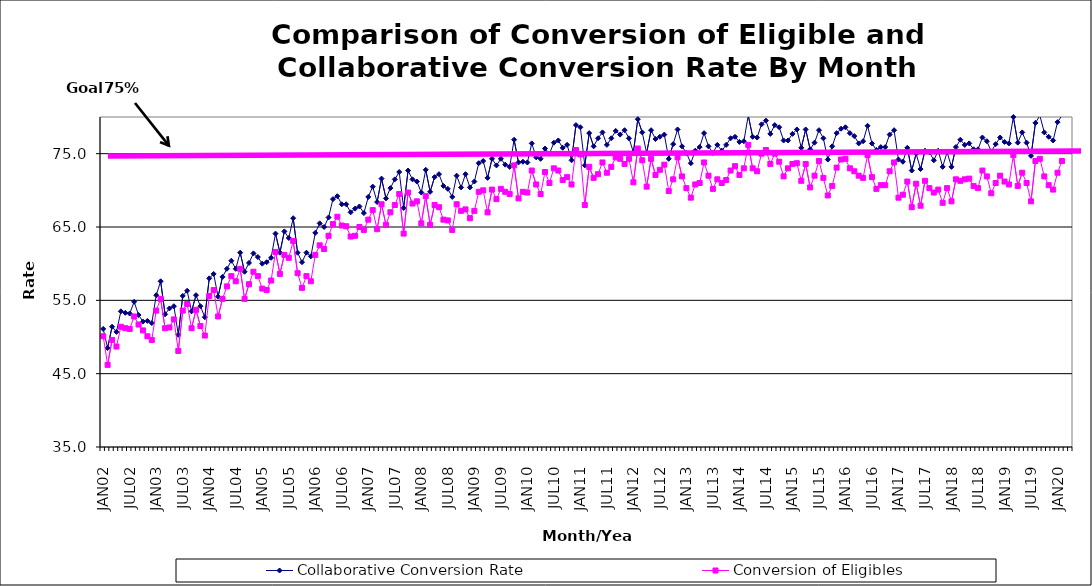
| Category | Collaborative Conversion Rate | Conversion of Eligibles |
|---|---|---|
| JAN02 | 51.1 | 50.1 |
| FEB02 | 48.5 | 46.2 |
| MAR02 | 51.4 | 49.6 |
| APR02 | 50.7 | 48.7 |
| MAY02 | 53.5 | 51.4 |
| JUN02 | 53.3 | 51.2 |
| JUL02 | 53.2 | 51.1 |
| AUG02 | 54.8 | 52.8 |
| SEP02 | 53 | 51.7 |
| OCT02 | 52.1 | 50.9 |
| NOV02 | 52.2 | 50.1 |
| DEC02 | 51.9 | 49.6 |
| JAN03 | 55.7 | 53.6 |
| FEB03 | 57.6 | 55.2 |
| MAR03 | 53.1 | 51.2 |
| APR03 | 53.9 | 51.3 |
| MAY03 | 54.2 | 52.4 |
| JUN03 | 50.3 | 48.1 |
| JUL03 | 55.6 | 53.6 |
| AUG03 | 56.3 | 54.5 |
| SEP03 | 53.5 | 51.2 |
| OCT03 | 55.7 | 53.7 |
| NOV03 | 54.2 | 51.5 |
| DEC03 | 52.7 | 50.2 |
| JAN04 | 58 | 55.6 |
| FEB04 | 58.6 | 56.4 |
| MAR04 | 55.5 | 52.8 |
| APR04 | 58.2 | 55.2 |
| MAY04 | 59.3 | 56.9 |
| JUN04 | 60.4 | 58.3 |
| JUL04 | 59.3 | 57.6 |
| AUG04 | 61.5 | 59.3 |
| SEP04 | 58.9 | 55.2 |
| OCT04 | 60.1 | 57.2 |
| NOV04 | 61.4 | 58.9 |
| DEC04 | 60.9 | 58.3 |
| JAN05 | 60 | 56.6 |
| FEB05 | 60.2 | 56.4 |
| MAR05 | 60.8 | 57.7 |
| APR05 | 64.1 | 61.6 |
| MAY05 | 61.5 | 58.6 |
| JUN05 | 64.4 | 61.2 |
| JUL05 | 63.5 | 60.8 |
| AUG05 | 66.2 | 63.1 |
| SEP05 | 61.5 | 58.7 |
| OCT05 | 60.2 | 56.7 |
| NOV05 | 61.5 | 58.3 |
| DEC05 | 61 | 57.6 |
| JAN06 | 64.2 | 61.2 |
| FEB06 | 65.5 | 62.5 |
| MAR06 | 65 | 62 |
| APR06 | 66.3 | 63.8 |
| MAY06 | 68.8 | 65.4 |
| JUN06 | 69.2 | 66.4 |
| JUL06 | 68.1 | 65.2 |
| AUG06 | 68.1 | 65.1 |
| SEP06 | 67 | 63.7 |
| OCT06 | 67.5 | 63.8 |
| NOV06 | 67.8 | 65 |
| DEC06 | 66.9 | 64.6 |
| JAN07 | 69.1 | 66 |
| FEB07 | 70.5 | 67.3 |
| MAR07 | 68.4 | 64.7 |
| APR07 | 71.6 | 68.1 |
| MAY07 | 68.9 | 65.3 |
| JUN07 | 70.3 | 67 |
| JUL07 | 71.5 | 68 |
| AUG07 | 72.5 | 69.5 |
| SEP07 | 67.6 | 64.1 |
| OCT07 | 72.7 | 69.7 |
| NOV07 | 71.5 | 68.2 |
| DEC07 | 71.2 | 68.5 |
| JAN08 | 69.7 | 65.5 |
| FEB08 | 72.8 | 69.2 |
| MAR08 | 69.8 | 65.3 |
| APR08 | 71.8 | 68 |
| MAY08 | 72.2 | 67.7 |
| JUN08 | 70.6 | 66 |
| JUL08 | 70.2 | 65.9 |
| AUG08 | 69.1 | 64.6 |
| SEP08 | 72 | 68.1 |
| OCT08 | 70.4 | 67.2 |
| NOV08 | 72.2 | 67.4 |
| DEC08 | 70.4 | 66.2 |
| JAN09 | 71.2 | 67.2 |
| FEB09 | 73.7 | 69.8 |
| MAR09 | 74 | 70 |
| APR09 | 71.7 | 67 |
| MAY09 | 74.3 | 70.1 |
| JUN09 | 73.4 | 68.8 |
| JUL09 | 74.3 | 70.2 |
| AUG09 | 73.5 | 69.8 |
| SEP09 | 73.2 | 69.5 |
| OCT09 | 76.9 | 73.4 |
| NOV09 | 73.8 | 68.9 |
| DEC09 | 73.9 | 69.8 |
| JAN10 | 73.8 | 69.7 |
| FEB10 | 76.4 | 72.7 |
| MAR10 | 74.5 | 70.8 |
| APR10 | 74.3 | 69.5 |
| MAY10 | 75.7 | 72.5 |
| JUN10 | 75 | 71 |
| JUL10 | 76.5 | 73 |
| AUG10 | 76.8 | 72.7 |
| SEP10 | 75.8 | 71.4 |
| OCT10 | 76.2 | 71.8 |
| NOV10 | 74.1 | 70.8 |
| DEC10 | 78.9 | 75.5 |
| JAN11 | 78.6 | 74.9 |
| FEB11 | 73.4 | 68 |
| MAR11 | 77.8 | 73.2 |
| APR11 | 76 | 71.7 |
| MAY11 | 77.1 | 72.2 |
| JUN11 | 77.9 | 73.8 |
| JUL11 | 76.2 | 72.4 |
| AUG11 | 77.1 | 73.2 |
| SEP11 | 78.1 | 74.5 |
| OCT11 | 77.6 | 74.3 |
| NOV11 | 78.2 | 73.6 |
| DEC11 | 77.1 | 74.3 |
| JAN12 | 75.2 | 71.1 |
| FEB12 | 79.7 | 75.7 |
| MAR12 | 77.9 | 74.1 |
| APR12 | 75.1 | 70.5 |
| MAY12 | 78.2 | 74.3 |
| JUN12 | 77 | 72.1 |
| JUL12 | 77.3 | 72.8 |
| AUG12 | 77.6 | 73.5 |
| SEP12 | 74.3 | 69.9 |
| OCT12 | 76.3 | 71.5 |
| NOV12 | 78.3 | 74.5 |
| DEC12 | 76 | 71.9 |
| JAN13 | 75.1 | 70.3 |
| FEB13 | 73.7 | 69 |
| MAR13 | 75.4 | 70.8 |
| APR13 | 75.9 | 71 |
| MAY13 | 77.8 | 73.8 |
| JUN13 | 76 | 72 |
| JUL13 | 75.1 | 70.2 |
| AUG13 | 76.2 | 71.5 |
| SEP13 | 75.4 | 71 |
| OCT13 | 76.2 | 71.4 |
| NOV13 | 77.1 | 72.7 |
| DEC13 | 77.3 | 73.3 |
| JAN14 | 76.6 | 72.1 |
| FEB14 | 76.7 | 73 |
| MAR14 | 80.2 | 76.2 |
| APR14 | 77.3 | 73 |
| MAY14 | 77.2 | 72.6 |
| JUN14 | 79 | 75 |
| JUL14 | 79.5 | 75.5 |
| AUG14 | 77.7 | 73.6 |
| SEP14 | 78.9 | 75 |
| OCT14 | 78.6 | 73.9 |
| NOV14 | 76.8 | 71.9 |
| DEC14 | 76.8 | 73 |
| JAN15 | 77.7 | 73.6 |
| FEB15 | 78.3 | 73.7 |
| MAR15 | 75.8 | 71.3 |
| APR15 | 78.3 | 73.6 |
| MAY15 | 75.6 | 70.4 |
| JUN15 | 76.5 | 72 |
| JUL15 | 78.2 | 74 |
| AUG15 | 77.1 | 71.7 |
| SEP15 | 74.2 | 69.3 |
| OCT15 | 76 | 70.6 |
| NOV15 | 77.8 | 73.1 |
| DEC15 | 78.4 | 74.2 |
| JAN16 | 78.6 | 74.3 |
| FEB16 | 77.8 | 73 |
| MAR16 | 77.4 | 72.6 |
| APR16 | 76.4 | 72 |
| MAY16 | 76.7 | 71.7 |
| JUN16 | 78.8 | 74.8 |
| JUL16 | 76.4 | 71.8 |
| AUG16 | 75.5 | 70.2 |
| SEP16 | 75.9 | 70.7 |
| OCT16 | 75.9 | 70.7 |
| NOV16 | 77.6 | 72.6 |
| DEC16 | 78.2 | 73.8 |
| JAN17 | 74.2 | 69 |
| FEB17 | 73.9 | 69.4 |
| MAR17 | 75.8 | 71.2 |
| APR17 | 72.7 | 67.7 |
| MAY17 | 75 | 70.9 |
| JUN17 | 72.9 | 67.9 |
| JUL17 | 75.4 | 71.3 |
| AUG17 | 75.2 | 70.3 |
| SEP17 | 74.1 | 69.7 |
| OCT17 | 75.4 | 70.1 |
| NOV17 | 73.2 | 68.3 |
| DEC17 | 75.2 | 70.3 |
| JAN18 | 73.2 | 68.5 |
| FEB18 | 75.9 | 71.5 |
| MAR18 | 76.9 | 71.3 |
| APR18 | 76.2 | 71.5 |
| MAY18 | 76.4 | 71.6 |
| JUN18 | 75.6 | 70.6 |
| JUL18 | 75.6 | 70.3 |
| AUG18 | 77.2 | 72.7 |
| SEP18 | 76.7 | 71.9 |
| OCT18 | 75.3 | 69.6 |
| NOV18 | 76.3 | 71 |
| DEC18 | 77.2 | 72 |
| JAN19 | 76.6 | 71.2 |
| FEB19 | 76.4 | 70.8 |
| MAR19 | 80 | 74.8 |
| APR19 | 76.5 | 70.6 |
| MAY19 | 77.9 | 72.4 |
| JUN19 | 76.5 | 71 |
| JUL19 | 74.7 | 68.5 |
| AUG19 | 79.2 | 74 |
| SEP19 | 80.2 | 74.3 |
| OCT19 | 77.9 | 71.9 |
| NOV19 | 77.3 | 70.7 |
| DEC19 | 76.8 | 70.1 |
| JAN20 | 79.3 | 72.4 |
| FEB20 | 80.2 | 74 |